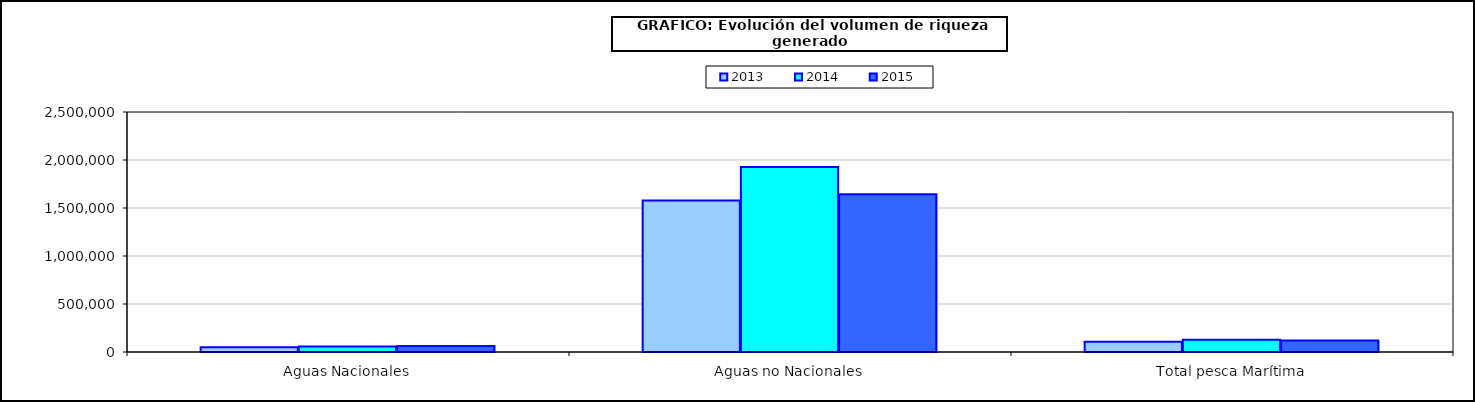
| Category | 2013 | 2014 | 2015 |
|---|---|---|---|
| 0 | 49553.023 | 57813.868 | 61721.457 |
| 1 | 1578467.456 | 1927671.969 | 1642691.799 |
| 2 | 107603.704 | 127271.635 | 119982.334 |